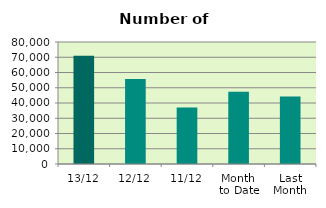
| Category | Series 0 |
|---|---|
| 13/12 | 70920 |
| 12/12 | 55714 |
| 11/12 | 37038 |
| Month 
to Date | 47409.4 |
| Last
Month | 44331.238 |